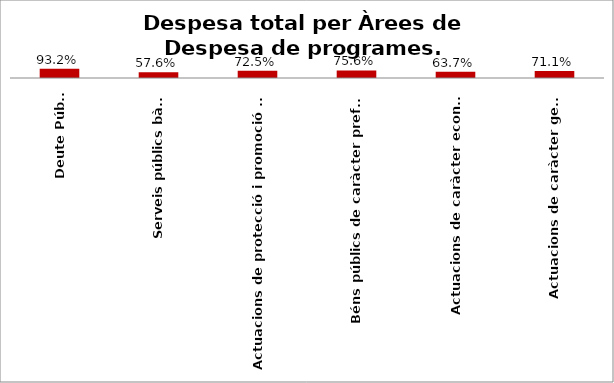
| Category | Series 0 |
|---|---|
| Deute Públic | 0.932 |
| Serveis públics bàsics | 0.576 |
| Actuacions de protecció i promoció social | 0.725 |
| Béns públics de caràcter preferent | 0.756 |
| Actuacions de caràcter econòmic | 0.637 |
| Actuacions de caràcter general | 0.711 |